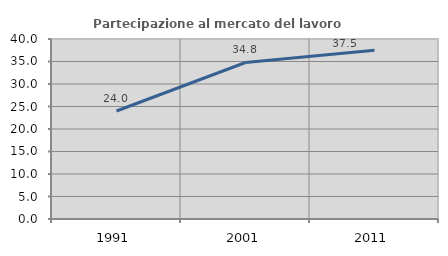
| Category | Partecipazione al mercato del lavoro  femminile |
|---|---|
| 1991.0 | 24 |
| 2001.0 | 34.783 |
| 2011.0 | 37.5 |